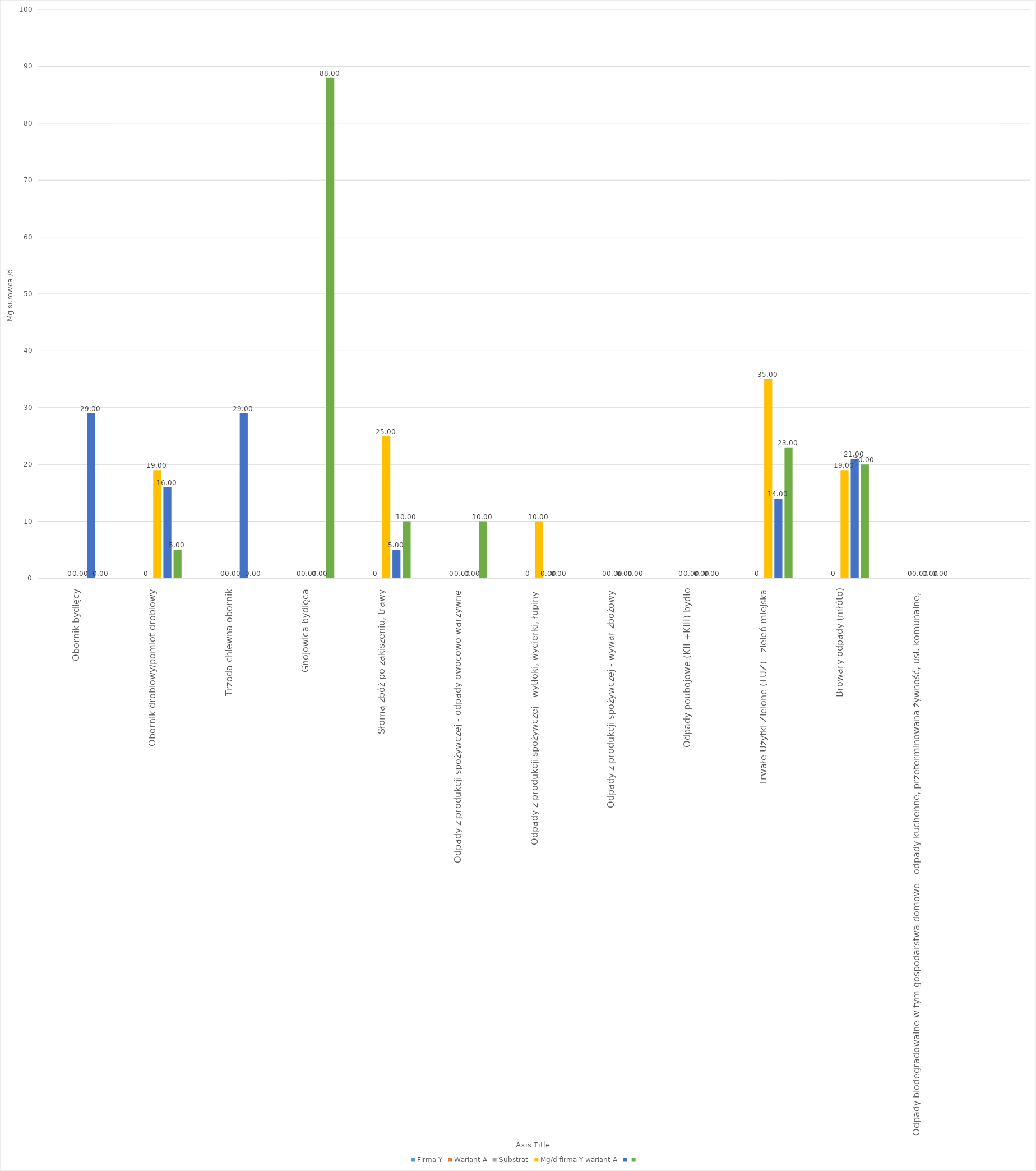
| Category | Firma Y | Wariant A | Substrat | Mg/d firma Y wariant A | Series 4 | Series 5 |
|---|---|---|---|---|---|---|
| Obornik bydlęcy |  |  | 0 | 0 | 29 | 0 |
| Obornik drobiowy/pomiot drobiowy |  |  | 0 | 19 | 16 | 5 |
| Trzoda chlewna obornik |  |  | 0 | 0 | 29 | 0 |
| Gnojowica bydlęca |  |  | 0 | 0 | 0 | 88 |
| Słoma zbóż po zakiszeniu, trawy |  |  | 0 | 25 | 5 | 10 |
| Odpady z produkcji spożywczej - odpady owocowo warzywne |  |  | 0 | 0 | 0 | 10 |
| Odpady z produkcji spożywczej - wytłoki, wycierki, łupiny |  |  | 0 | 10 | 0 | 0 |
| Odpady z produkcji spożywczej - wywar zbożowy |  |  | 0 | 0 | 0 | 0 |
| Odpady poubojowe (KII +KIII) bydło |  |  | 0 | 0 | 0 | 0 |
| Trwałe Użytki Zielone (TUZ) - zieleń miejska |  |  | 0 | 35 | 14 | 23 |
| Browary odpady (młóto) |  |  | 0 | 19 | 21 | 20 |
| Odpady biodegradowalne w tym gospodarstwa domowe - odpady kuchenne, przeterminowana żywność, usł. komunalne,  |  |  | 0 | 0 | 0 | 0 |